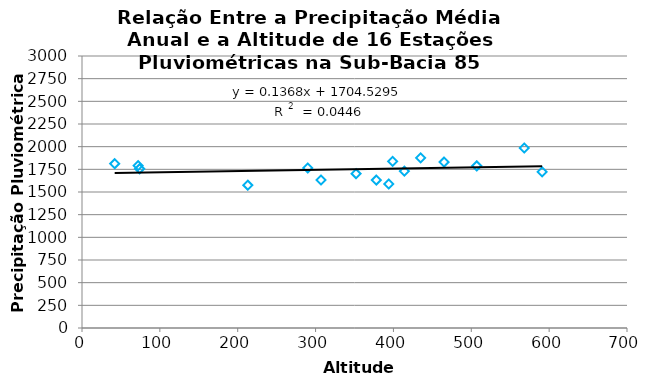
| Category | Series 0 |
|---|---|
| 399.0 | 1838.007 |
| 213.0 | 1574.728 |
| 394.0 | 1587.831 |
| 74.0 | 1756.701 |
| 465.0 | 1829.814 |
| 307.0 | 1632.863 |
| 435.0 | 1876.053 |
| 42.0 | 1812.307 |
| 290.0 | 1765.11 |
| 72.0 | 1790.96 |
| 378.0 | 1631.313 |
| 352.0 | 1702.067 |
| 507.0 | 1788.276 |
| 414.0 | 1730.428 |
| 591.0 | 1722.653 |
| 568.0 | 1985.653 |